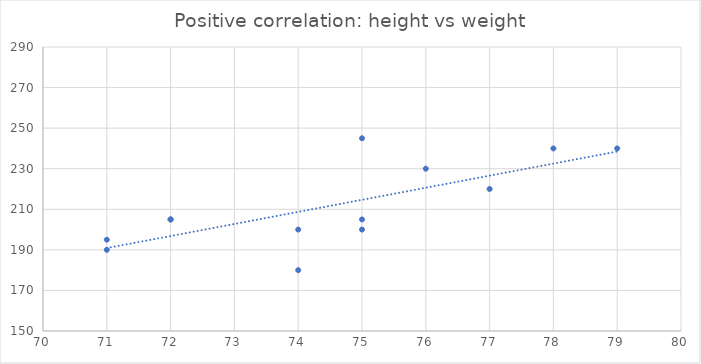
| Category | Weight (lbs) |
|---|---|
| 76.0 | 230 |
| 75.0 | 200 |
| 75.0 | 245 |
| 74.0 | 200 |
| 75.0 | 205 |
| 72.0 | 205 |
| 79.0 | 240 |
| 77.0 | 220 |
| 71.0 | 195 |
| 72.0 | 205 |
| 71.0 | 190 |
| 74.0 | 180 |
| 78.0 | 240 |